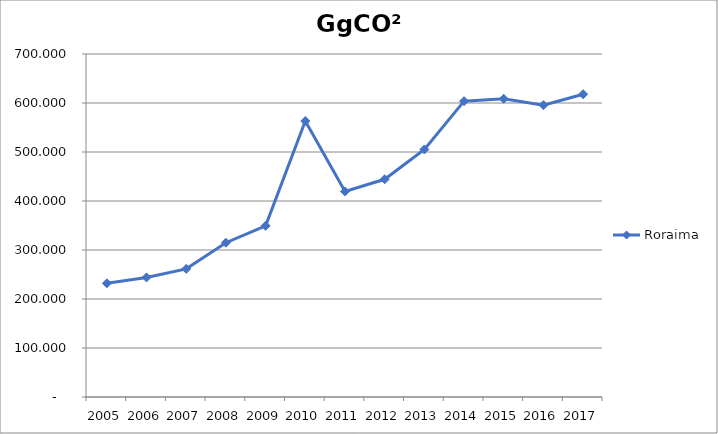
| Category | Roraima |
|---|---|
| 2005.0 | 231.993 |
| 2006.0 | 244.012 |
| 2007.0 | 261.5 |
| 2008.0 | 314.838 |
| 2009.0 | 349.312 |
| 2010.0 | 563.207 |
| 2011.0 | 419.565 |
| 2012.0 | 444.331 |
| 2013.0 | 505.235 |
| 2014.0 | 603.771 |
| 2015.0 | 608.593 |
| 2016.0 | 595.549 |
| 2017.0 | 617.951 |